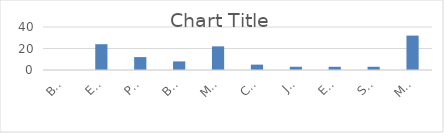
| Category | Series 0 |
|---|---|
| BABY  | 0 |
| EVEIL ATHLE | 24 |
| POUSSIN  | 12 |
| BENJAMIN  | 8 |
| MINIME  | 22 |
| CADET  | 5 |
| JUNIOR  | 3 |
| ESPOIR  | 3 |
| SENIOR  | 3 |
| MASTER  | 32 |